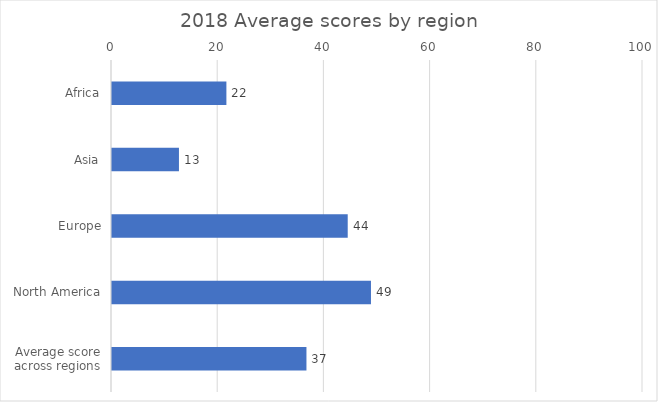
| Category | Average score |
|---|---|
| Africa | 21.544 |
| Asia | 12.609 |
| Europe | 44.392 |
| North America | 48.771 |
| Average score across regions | 36.62 |